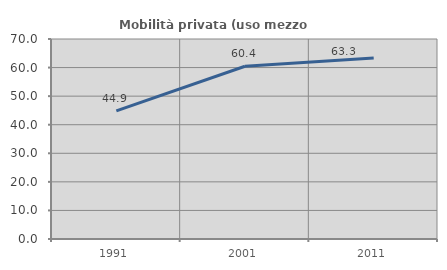
| Category | Mobilità privata (uso mezzo privato) |
|---|---|
| 1991.0 | 44.862 |
| 2001.0 | 60.449 |
| 2011.0 | 63.32 |